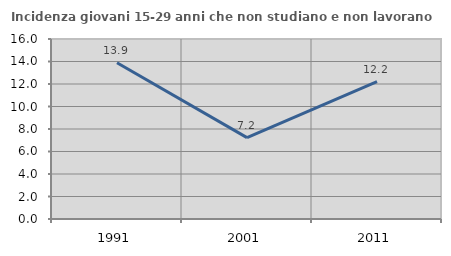
| Category | Incidenza giovani 15-29 anni che non studiano e non lavorano  |
|---|---|
| 1991.0 | 13.886 |
| 2001.0 | 7.229 |
| 2011.0 | 12.219 |